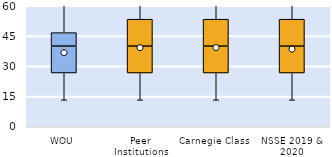
| Category | 25th | 50th | 75th |
|---|---|---|---|
| WOU | 26.667 | 13.333 | 6.667 |
| Peer Institutions | 26.667 | 13.333 | 13.333 |
| Carnegie Class | 26.667 | 13.333 | 13.333 |
| NSSE 2019 & 2020 | 26.667 | 13.333 | 13.333 |